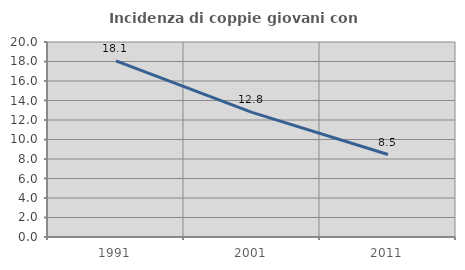
| Category | Incidenza di coppie giovani con figli |
|---|---|
| 1991.0 | 18.062 |
| 2001.0 | 12.775 |
| 2011.0 | 8.458 |